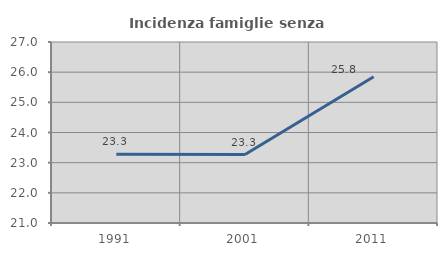
| Category | Incidenza famiglie senza nuclei |
|---|---|
| 1991.0 | 23.276 |
| 2001.0 | 23.269 |
| 2011.0 | 25.845 |